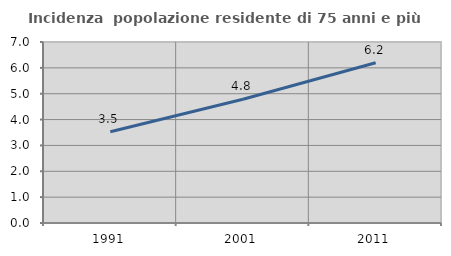
| Category | Incidenza  popolazione residente di 75 anni e più |
|---|---|
| 1991.0 | 3.531 |
| 2001.0 | 4.787 |
| 2011.0 | 6.199 |